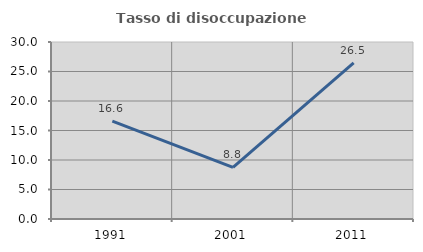
| Category | Tasso di disoccupazione giovanile  |
|---|---|
| 1991.0 | 16.59 |
| 2001.0 | 8.759 |
| 2011.0 | 26.471 |